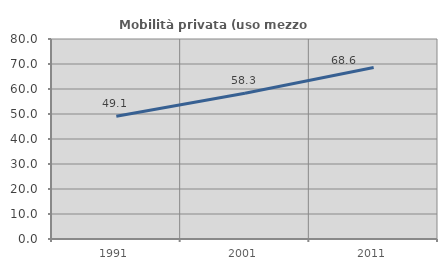
| Category | Mobilità privata (uso mezzo privato) |
|---|---|
| 1991.0 | 49.107 |
| 2001.0 | 58.306 |
| 2011.0 | 68.613 |